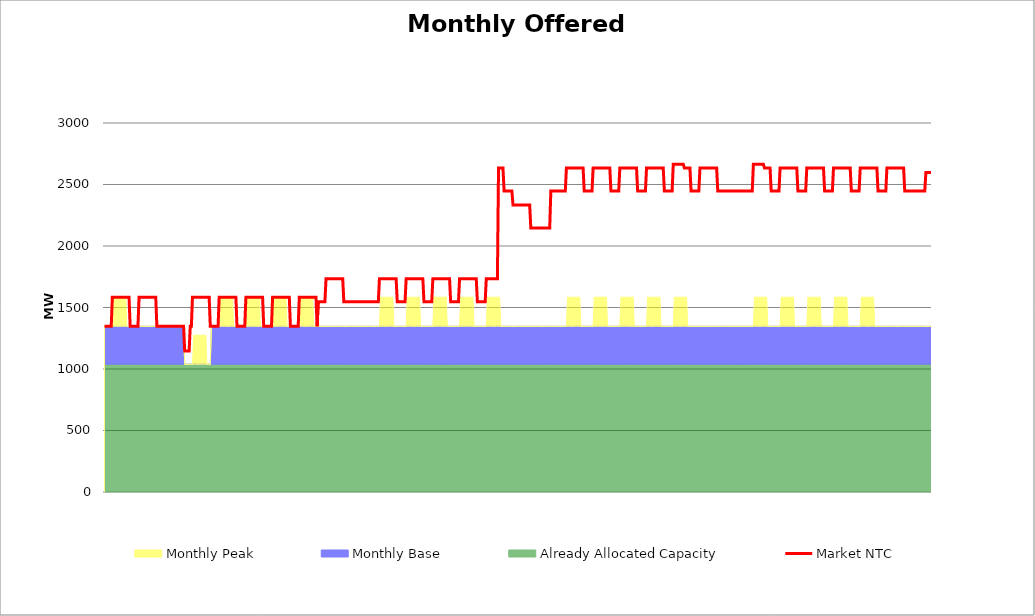
| Category | Market NTC |
|---|---|
| 0 | 1347 |
| 1 | 1347 |
| 2 | 1347 |
| 3 | 1347 |
| 4 | 1347 |
| 5 | 1347 |
| 6 | 1347 |
| 7 | 1584 |
| 8 | 1584 |
| 9 | 1584 |
| 10 | 1584 |
| 11 | 1584 |
| 12 | 1584 |
| 13 | 1584 |
| 14 | 1584 |
| 15 | 1584 |
| 16 | 1584 |
| 17 | 1584 |
| 18 | 1584 |
| 19 | 1584 |
| 20 | 1584 |
| 21 | 1584 |
| 22 | 1584 |
| 23 | 1347 |
| 24 | 1347 |
| 25 | 1347 |
| 26 | 1347 |
| 27 | 1347 |
| 28 | 1347 |
| 29 | 1347 |
| 30 | 1347 |
| 31 | 1584 |
| 32 | 1584 |
| 33 | 1584 |
| 34 | 1584 |
| 35 | 1584 |
| 36 | 1584 |
| 37 | 1584 |
| 38 | 1584 |
| 39 | 1584 |
| 40 | 1584 |
| 41 | 1584 |
| 42 | 1584 |
| 43 | 1584 |
| 44 | 1584 |
| 45 | 1584 |
| 46 | 1584 |
| 47 | 1347 |
| 48 | 1347 |
| 49 | 1347 |
| 50 | 1347 |
| 51 | 1347 |
| 52 | 1347 |
| 53 | 1347 |
| 54 | 1347 |
| 55 | 1347 |
| 56 | 1347 |
| 57 | 1347 |
| 58 | 1347 |
| 59 | 1347 |
| 60 | 1347 |
| 61 | 1347 |
| 62 | 1347 |
| 63 | 1347 |
| 64 | 1347 |
| 65 | 1347 |
| 66 | 1347 |
| 67 | 1347 |
| 68 | 1347 |
| 69 | 1347 |
| 70 | 1347 |
| 71 | 1347 |
| 72 | 1147 |
| 73 | 1147 |
| 74 | 1147 |
| 75 | 1147 |
| 76 | 1147 |
| 77 | 1347 |
| 78 | 1347 |
| 79 | 1584 |
| 80 | 1584 |
| 81 | 1584 |
| 82 | 1584 |
| 83 | 1584 |
| 84 | 1584 |
| 85 | 1584 |
| 86 | 1584 |
| 87 | 1584 |
| 88 | 1584 |
| 89 | 1584 |
| 90 | 1584 |
| 91 | 1584 |
| 92 | 1584 |
| 93 | 1584 |
| 94 | 1584 |
| 95 | 1347 |
| 96 | 1347 |
| 97 | 1347 |
| 98 | 1347 |
| 99 | 1347 |
| 100 | 1347 |
| 101 | 1347 |
| 102 | 1347 |
| 103 | 1584 |
| 104 | 1584 |
| 105 | 1584 |
| 106 | 1584 |
| 107 | 1584 |
| 108 | 1584 |
| 109 | 1584 |
| 110 | 1584 |
| 111 | 1584 |
| 112 | 1584 |
| 113 | 1584 |
| 114 | 1584 |
| 115 | 1584 |
| 116 | 1584 |
| 117 | 1584 |
| 118 | 1584 |
| 119 | 1347 |
| 120 | 1347 |
| 121 | 1347 |
| 122 | 1347 |
| 123 | 1347 |
| 124 | 1347 |
| 125 | 1347 |
| 126 | 1347 |
| 127 | 1584 |
| 128 | 1584 |
| 129 | 1584 |
| 130 | 1584 |
| 131 | 1584 |
| 132 | 1584 |
| 133 | 1584 |
| 134 | 1584 |
| 135 | 1584 |
| 136 | 1584 |
| 137 | 1584 |
| 138 | 1584 |
| 139 | 1584 |
| 140 | 1584 |
| 141 | 1584 |
| 142 | 1584 |
| 143 | 1347 |
| 144 | 1347 |
| 145 | 1347 |
| 146 | 1347 |
| 147 | 1347 |
| 148 | 1347 |
| 149 | 1347 |
| 150 | 1347 |
| 151 | 1584 |
| 152 | 1584 |
| 153 | 1584 |
| 154 | 1584 |
| 155 | 1584 |
| 156 | 1584 |
| 157 | 1584 |
| 158 | 1584 |
| 159 | 1584 |
| 160 | 1584 |
| 161 | 1584 |
| 162 | 1584 |
| 163 | 1584 |
| 164 | 1584 |
| 165 | 1584 |
| 166 | 1584 |
| 167 | 1347 |
| 168 | 1347 |
| 169 | 1347 |
| 170 | 1347 |
| 171 | 1347 |
| 172 | 1347 |
| 173 | 1347 |
| 174 | 1347 |
| 175 | 1584 |
| 176 | 1584 |
| 177 | 1584 |
| 178 | 1584 |
| 179 | 1584 |
| 180 | 1584 |
| 181 | 1584 |
| 182 | 1584 |
| 183 | 1584 |
| 184 | 1584 |
| 185 | 1584 |
| 186 | 1584 |
| 187 | 1584 |
| 188 | 1584 |
| 189 | 1584 |
| 190 | 1584 |
| 191 | 1347 |
| 192 | 1547 |
| 193 | 1547 |
| 194 | 1547 |
| 195 | 1547 |
| 196 | 1547 |
| 197 | 1547 |
| 198 | 1547 |
| 199 | 1734 |
| 200 | 1734 |
| 201 | 1734 |
| 202 | 1734 |
| 203 | 1734 |
| 204 | 1734 |
| 205 | 1734 |
| 206 | 1734 |
| 207 | 1734 |
| 208 | 1734 |
| 209 | 1734 |
| 210 | 1734 |
| 211 | 1734 |
| 212 | 1734 |
| 213 | 1734 |
| 214 | 1734 |
| 215 | 1547 |
| 216 | 1547 |
| 217 | 1547 |
| 218 | 1547 |
| 219 | 1547 |
| 220 | 1547 |
| 221 | 1547 |
| 222 | 1547 |
| 223 | 1547 |
| 224 | 1547 |
| 225 | 1547 |
| 226 | 1547 |
| 227 | 1547 |
| 228 | 1547 |
| 229 | 1547 |
| 230 | 1547 |
| 231 | 1547 |
| 232 | 1547 |
| 233 | 1547 |
| 234 | 1547 |
| 235 | 1547 |
| 236 | 1547 |
| 237 | 1547 |
| 238 | 1547 |
| 239 | 1547 |
| 240 | 1547 |
| 241 | 1547 |
| 242 | 1547 |
| 243 | 1547 |
| 244 | 1547 |
| 245 | 1547 |
| 246 | 1547 |
| 247 | 1734 |
| 248 | 1734 |
| 249 | 1734 |
| 250 | 1734 |
| 251 | 1734 |
| 252 | 1734 |
| 253 | 1734 |
| 254 | 1734 |
| 255 | 1734 |
| 256 | 1734 |
| 257 | 1734 |
| 258 | 1734 |
| 259 | 1734 |
| 260 | 1734 |
| 261 | 1734 |
| 262 | 1734 |
| 263 | 1547 |
| 264 | 1547 |
| 265 | 1547 |
| 266 | 1547 |
| 267 | 1547 |
| 268 | 1547 |
| 269 | 1547 |
| 270 | 1547 |
| 271 | 1734 |
| 272 | 1734 |
| 273 | 1734 |
| 274 | 1734 |
| 275 | 1734 |
| 276 | 1734 |
| 277 | 1734 |
| 278 | 1734 |
| 279 | 1734 |
| 280 | 1734 |
| 281 | 1734 |
| 282 | 1734 |
| 283 | 1734 |
| 284 | 1734 |
| 285 | 1734 |
| 286 | 1734 |
| 287 | 1547 |
| 288 | 1547 |
| 289 | 1547 |
| 290 | 1547 |
| 291 | 1547 |
| 292 | 1547 |
| 293 | 1547 |
| 294 | 1547 |
| 295 | 1734 |
| 296 | 1734 |
| 297 | 1734 |
| 298 | 1734 |
| 299 | 1734 |
| 300 | 1734 |
| 301 | 1734 |
| 302 | 1734 |
| 303 | 1734 |
| 304 | 1734 |
| 305 | 1734 |
| 306 | 1734 |
| 307 | 1734 |
| 308 | 1734 |
| 309 | 1734 |
| 310 | 1734 |
| 311 | 1547 |
| 312 | 1547 |
| 313 | 1547 |
| 314 | 1547 |
| 315 | 1547 |
| 316 | 1547 |
| 317 | 1547 |
| 318 | 1547 |
| 319 | 1734 |
| 320 | 1734 |
| 321 | 1734 |
| 322 | 1734 |
| 323 | 1734 |
| 324 | 1734 |
| 325 | 1734 |
| 326 | 1734 |
| 327 | 1734 |
| 328 | 1734 |
| 329 | 1734 |
| 330 | 1734 |
| 331 | 1734 |
| 332 | 1734 |
| 333 | 1734 |
| 334 | 1734 |
| 335 | 1547 |
| 336 | 1547 |
| 337 | 1547 |
| 338 | 1547 |
| 339 | 1547 |
| 340 | 1547 |
| 341 | 1547 |
| 342 | 1547 |
| 343 | 1734 |
| 344 | 1734 |
| 345 | 1734 |
| 346 | 1734 |
| 347 | 1734 |
| 348 | 1734 |
| 349 | 1734 |
| 350 | 1734 |
| 351 | 1734 |
| 352 | 1734 |
| 353 | 1734 |
| 354 | 2634 |
| 355 | 2634 |
| 356 | 2634 |
| 357 | 2634 |
| 358 | 2634 |
| 359 | 2447 |
| 360 | 2447 |
| 361 | 2447 |
| 362 | 2447 |
| 363 | 2447 |
| 364 | 2447 |
| 365 | 2447 |
| 366 | 2447 |
| 367 | 2334 |
| 368 | 2334 |
| 369 | 2334 |
| 370 | 2334 |
| 371 | 2334 |
| 372 | 2334 |
| 373 | 2334 |
| 374 | 2334 |
| 375 | 2334 |
| 376 | 2334 |
| 377 | 2334 |
| 378 | 2334 |
| 379 | 2334 |
| 380 | 2334 |
| 381 | 2334 |
| 382 | 2334 |
| 383 | 2147 |
| 384 | 2147 |
| 385 | 2147 |
| 386 | 2147 |
| 387 | 2147 |
| 388 | 2147 |
| 389 | 2147 |
| 390 | 2147 |
| 391 | 2147 |
| 392 | 2147 |
| 393 | 2147 |
| 394 | 2147 |
| 395 | 2147 |
| 396 | 2147 |
| 397 | 2147 |
| 398 | 2147 |
| 399 | 2147 |
| 400 | 2147 |
| 401 | 2447 |
| 402 | 2447 |
| 403 | 2447 |
| 404 | 2447 |
| 405 | 2447 |
| 406 | 2447 |
| 407 | 2447 |
| 408 | 2447 |
| 409 | 2447 |
| 410 | 2447 |
| 411 | 2447 |
| 412 | 2447 |
| 413 | 2447 |
| 414 | 2447 |
| 415 | 2634 |
| 416 | 2634 |
| 417 | 2634 |
| 418 | 2634 |
| 419 | 2634 |
| 420 | 2634 |
| 421 | 2634 |
| 422 | 2634 |
| 423 | 2634 |
| 424 | 2634 |
| 425 | 2634 |
| 426 | 2634 |
| 427 | 2634 |
| 428 | 2634 |
| 429 | 2634 |
| 430 | 2634 |
| 431 | 2447 |
| 432 | 2447 |
| 433 | 2447 |
| 434 | 2447 |
| 435 | 2447 |
| 436 | 2447 |
| 437 | 2447 |
| 438 | 2447 |
| 439 | 2634 |
| 440 | 2634 |
| 441 | 2634 |
| 442 | 2634 |
| 443 | 2634 |
| 444 | 2634 |
| 445 | 2634 |
| 446 | 2634 |
| 447 | 2634 |
| 448 | 2634 |
| 449 | 2634 |
| 450 | 2634 |
| 451 | 2634 |
| 452 | 2634 |
| 453 | 2634 |
| 454 | 2634 |
| 455 | 2447 |
| 456 | 2447 |
| 457 | 2447 |
| 458 | 2447 |
| 459 | 2447 |
| 460 | 2447 |
| 461 | 2447 |
| 462 | 2447 |
| 463 | 2634 |
| 464 | 2634 |
| 465 | 2634 |
| 466 | 2634 |
| 467 | 2634 |
| 468 | 2634 |
| 469 | 2634 |
| 470 | 2634 |
| 471 | 2634 |
| 472 | 2634 |
| 473 | 2634 |
| 474 | 2634 |
| 475 | 2634 |
| 476 | 2634 |
| 477 | 2634 |
| 478 | 2634 |
| 479 | 2447 |
| 480 | 2447 |
| 481 | 2447 |
| 482 | 2447 |
| 483 | 2447 |
| 484 | 2447 |
| 485 | 2447 |
| 486 | 2447 |
| 487 | 2634 |
| 488 | 2634 |
| 489 | 2634 |
| 490 | 2634 |
| 491 | 2634 |
| 492 | 2634 |
| 493 | 2634 |
| 494 | 2634 |
| 495 | 2634 |
| 496 | 2634 |
| 497 | 2634 |
| 498 | 2634 |
| 499 | 2634 |
| 500 | 2634 |
| 501 | 2634 |
| 502 | 2634 |
| 503 | 2447 |
| 504 | 2447 |
| 505 | 2447 |
| 506 | 2447 |
| 507 | 2447 |
| 508 | 2447 |
| 509 | 2447 |
| 510 | 2447 |
| 511 | 2664 |
| 512 | 2664 |
| 513 | 2664 |
| 514 | 2664 |
| 515 | 2664 |
| 516 | 2664 |
| 517 | 2664 |
| 518 | 2664 |
| 519 | 2664 |
| 520 | 2664 |
| 521 | 2634 |
| 522 | 2634 |
| 523 | 2634 |
| 524 | 2634 |
| 525 | 2634 |
| 526 | 2634 |
| 527 | 2447 |
| 528 | 2447 |
| 529 | 2447 |
| 530 | 2447 |
| 531 | 2447 |
| 532 | 2447 |
| 533 | 2447 |
| 534 | 2447 |
| 535 | 2634 |
| 536 | 2634 |
| 537 | 2634 |
| 538 | 2634 |
| 539 | 2634 |
| 540 | 2634 |
| 541 | 2634 |
| 542 | 2634 |
| 543 | 2634 |
| 544 | 2634 |
| 545 | 2634 |
| 546 | 2634 |
| 547 | 2634 |
| 548 | 2634 |
| 549 | 2634 |
| 550 | 2634 |
| 551 | 2447 |
| 552 | 2447 |
| 553 | 2447 |
| 554 | 2447 |
| 555 | 2447 |
| 556 | 2447 |
| 557 | 2447 |
| 558 | 2447 |
| 559 | 2447 |
| 560 | 2447 |
| 561 | 2447 |
| 562 | 2447 |
| 563 | 2447 |
| 564 | 2447 |
| 565 | 2447 |
| 566 | 2447 |
| 567 | 2447 |
| 568 | 2447 |
| 569 | 2447 |
| 570 | 2447 |
| 571 | 2447 |
| 572 | 2447 |
| 573 | 2447 |
| 574 | 2447 |
| 575 | 2447 |
| 576 | 2447 |
| 577 | 2447 |
| 578 | 2447 |
| 579 | 2447 |
| 580 | 2447 |
| 581 | 2447 |
| 582 | 2447 |
| 583 | 2664 |
| 584 | 2664 |
| 585 | 2664 |
| 586 | 2664 |
| 587 | 2664 |
| 588 | 2664 |
| 589 | 2664 |
| 590 | 2664 |
| 591 | 2664 |
| 592 | 2664 |
| 593 | 2634 |
| 594 | 2634 |
| 595 | 2634 |
| 596 | 2634 |
| 597 | 2634 |
| 598 | 2634 |
| 599 | 2447 |
| 600 | 2447 |
| 601 | 2447 |
| 602 | 2447 |
| 603 | 2447 |
| 604 | 2447 |
| 605 | 2447 |
| 606 | 2447 |
| 607 | 2634 |
| 608 | 2634 |
| 609 | 2634 |
| 610 | 2634 |
| 611 | 2634 |
| 612 | 2634 |
| 613 | 2634 |
| 614 | 2634 |
| 615 | 2634 |
| 616 | 2634 |
| 617 | 2634 |
| 618 | 2634 |
| 619 | 2634 |
| 620 | 2634 |
| 621 | 2634 |
| 622 | 2634 |
| 623 | 2447 |
| 624 | 2447 |
| 625 | 2447 |
| 626 | 2447 |
| 627 | 2447 |
| 628 | 2447 |
| 629 | 2447 |
| 630 | 2447 |
| 631 | 2634 |
| 632 | 2634 |
| 633 | 2634 |
| 634 | 2634 |
| 635 | 2634 |
| 636 | 2634 |
| 637 | 2634 |
| 638 | 2634 |
| 639 | 2634 |
| 640 | 2634 |
| 641 | 2634 |
| 642 | 2634 |
| 643 | 2634 |
| 644 | 2634 |
| 645 | 2634 |
| 646 | 2634 |
| 647 | 2447 |
| 648 | 2447 |
| 649 | 2447 |
| 650 | 2447 |
| 651 | 2447 |
| 652 | 2447 |
| 653 | 2447 |
| 654 | 2447 |
| 655 | 2634 |
| 656 | 2634 |
| 657 | 2634 |
| 658 | 2634 |
| 659 | 2634 |
| 660 | 2634 |
| 661 | 2634 |
| 662 | 2634 |
| 663 | 2634 |
| 664 | 2634 |
| 665 | 2634 |
| 666 | 2634 |
| 667 | 2634 |
| 668 | 2634 |
| 669 | 2634 |
| 670 | 2634 |
| 671 | 2447 |
| 672 | 2447 |
| 673 | 2447 |
| 674 | 2447 |
| 675 | 2447 |
| 676 | 2447 |
| 677 | 2447 |
| 678 | 2447 |
| 679 | 2634 |
| 680 | 2634 |
| 681 | 2634 |
| 682 | 2634 |
| 683 | 2634 |
| 684 | 2634 |
| 685 | 2634 |
| 686 | 2634 |
| 687 | 2634 |
| 688 | 2634 |
| 689 | 2634 |
| 690 | 2634 |
| 691 | 2634 |
| 692 | 2634 |
| 693 | 2634 |
| 694 | 2634 |
| 695 | 2447 |
| 696 | 2447 |
| 697 | 2447 |
| 698 | 2447 |
| 699 | 2447 |
| 700 | 2447 |
| 701 | 2447 |
| 702 | 2447 |
| 703 | 2634 |
| 704 | 2634 |
| 705 | 2634 |
| 706 | 2634 |
| 707 | 2634 |
| 708 | 2634 |
| 709 | 2634 |
| 710 | 2634 |
| 711 | 2634 |
| 712 | 2634 |
| 713 | 2634 |
| 714 | 2634 |
| 715 | 2634 |
| 716 | 2634 |
| 717 | 2634 |
| 718 | 2634 |
| 719 | 2447 |
| 720 | 2447 |
| 721 | 2447 |
| 722 | 2447 |
| 723 | 2447 |
| 724 | 2447 |
| 725 | 2447 |
| 726 | 2447 |
| 727 | 2447 |
| 728 | 2447 |
| 729 | 2447 |
| 730 | 2447 |
| 731 | 2447 |
| 732 | 2447 |
| 733 | 2447 |
| 734 | 2447 |
| 735 | 2447 |
| 736 | 2447 |
| 737 | 2447 |
| 738 | 2597 |
| 739 | 2597 |
| 740 | 2597 |
| 741 | 2597 |
| 742 | 2597 |
| 743 | 2597 |